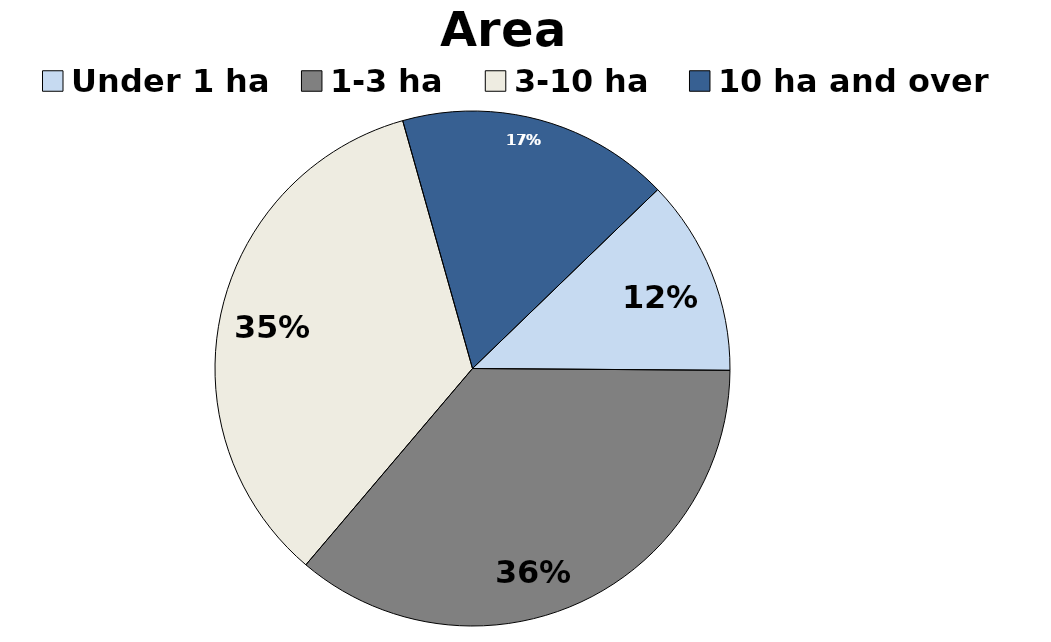
| Category | Area |
|---|---|
| Under 1 ha | 12.335 |
| 1-3 ha | 36.089 |
| 3-10 ha | 34.428 |
| 10 ha and over | 17.148 |